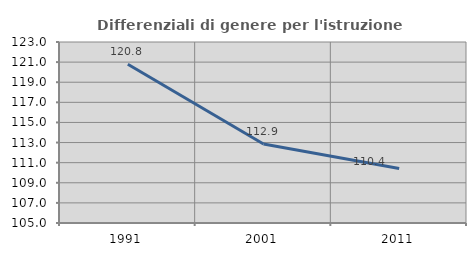
| Category | Differenziali di genere per l'istruzione superiore |
|---|---|
| 1991.0 | 120.783 |
| 2001.0 | 112.861 |
| 2011.0 | 110.427 |